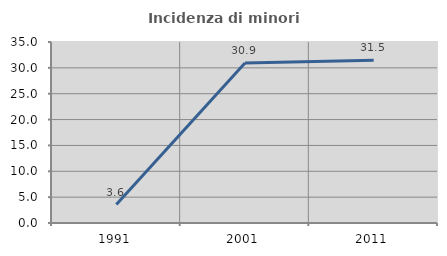
| Category | Incidenza di minori stranieri |
|---|---|
| 1991.0 | 3.571 |
| 2001.0 | 30.928 |
| 2011.0 | 31.473 |